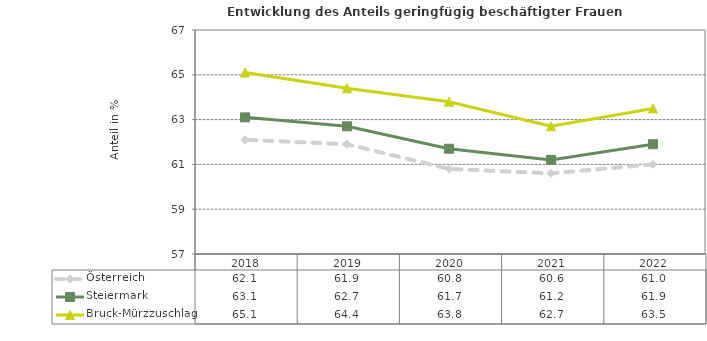
| Category | Österreich | Steiermark | Bruck-Mürzzuschlag |
|---|---|---|---|
| 2022.0 | 61 | 61.9 | 63.5 |
| 2021.0 | 60.6 | 61.2 | 62.7 |
| 2020.0 | 60.8 | 61.7 | 63.8 |
| 2019.0 | 61.9 | 62.7 | 64.4 |
| 2018.0 | 62.1 | 63.1 | 65.1 |